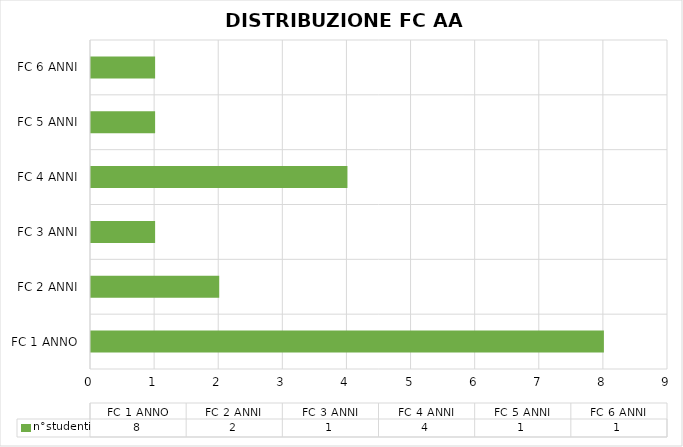
| Category | n°studenti |
|---|---|
| FC 1 ANNO | 8 |
| FC 2 ANNI | 2 |
| FC 3 ANNI | 1 |
| FC 4 ANNI | 4 |
| FC 5 ANNI | 1 |
| FC 6 ANNI | 1 |